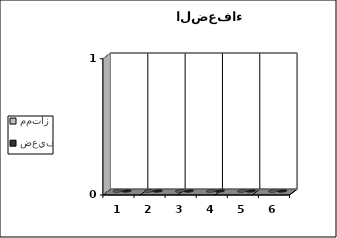
| Category | ممتاز | ضعيف |
|---|---|---|
| 0 | 0 | 0 |
| 1 | 0 | 0 |
| 2 | 0 | 0 |
| 3 | 0 | 0 |
| 4 | 0 | 0 |
| 5 | 0 | 0 |